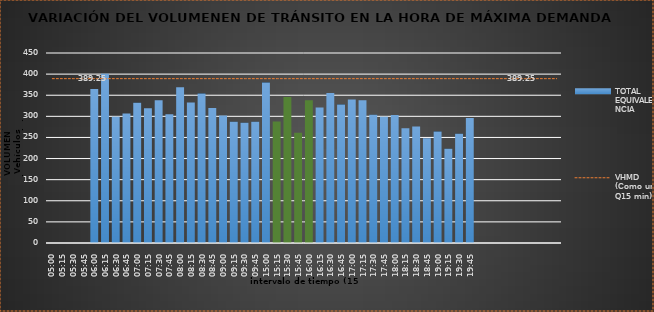
| Category | TOTAL EQUIVALENCIA   |
|---|---|
| 500.0 | 0 |
| 515.0 | 0 |
| 530.0 | 0 |
| 545.0 | 0 |
| 600.0 | 365 |
| 615.0 | 401 |
| 630.0 | 299 |
| 645.0 | 307 |
| 700.0 | 332 |
| 715.0 | 319 |
| 730.0 | 338 |
| 745.0 | 305 |
| 800.0 | 369 |
| 815.0 | 333 |
| 830.0 | 354 |
| 845.0 | 320 |
| 900.0 | 302 |
| 915.0 | 287 |
| 930.0 | 285 |
| 945.0 | 287 |
| 1500.0 | 380 |
| 1515.0 | 288 |
| 1530.0 | 346 |
| 1545.0 | 261 |
| 1600.0 | 338 |
| 1615.0 | 321 |
| 1630.0 | 355 |
| 1645.0 | 328 |
| 1700.0 | 340 |
| 1715.0 | 338 |
| 1730.0 | 304 |
| 1745.0 | 299 |
| 1800.0 | 303 |
| 1815.0 | 272 |
| 1830.0 | 276 |
| 1845.0 | 248 |
| 1900.0 | 264 |
| 1915.0 | 223 |
| 1930.0 | 259 |
| 1945.0 | 296 |